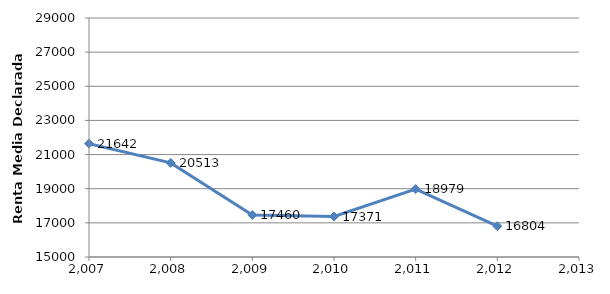
| Category | Series 0 |
|---|---|
| 2007.0 | 21642.4 |
| 2008.0 | 20512.76 |
| 2009.0 | 17459.608 |
| 2010.0 | 17371.392 |
| 2011.0 | 18979.425 |
| 2012.0 | 16804.414 |